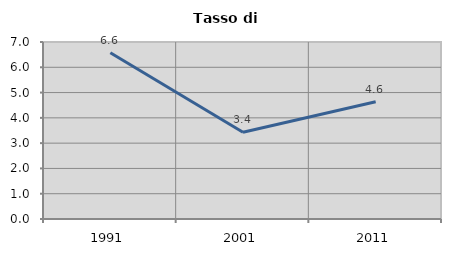
| Category | Tasso di disoccupazione   |
|---|---|
| 1991.0 | 6.574 |
| 2001.0 | 3.43 |
| 2011.0 | 4.635 |